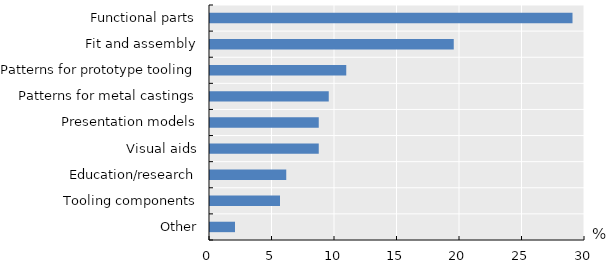
| Category | Series 0 |
|---|---|
| Other | 2 |
| Tooling components | 5.6 |
| Education/research | 6.1 |
| Visual aids | 8.7 |
| Presentation models | 8.7 |
| Patterns for metal castings | 9.5 |
| Patterns for prototype tooling | 10.9 |
| Fit and assembly | 19.5 |
| Functional parts | 29 |